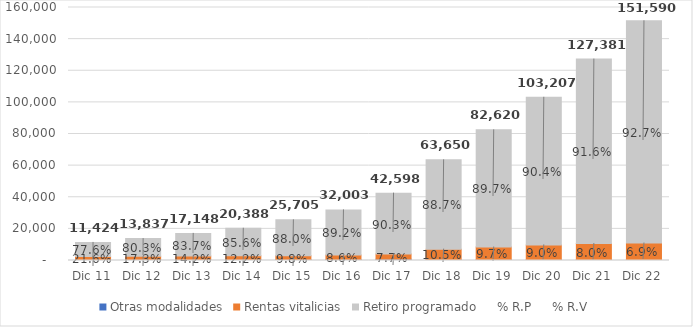
| Category | Otras modalidades | Rentas vitalicias | Retiro programado |
|---|---|---|---|
| Dic 11 | 95 | 2469 | 8860 |
| Dic 12 | 328 | 2394 | 11115 |
| Dic 13 | 369 | 2432 | 14347 |
| Dic 14 | 449 | 2497 | 17442 |
| Dic 15 | 563 | 2518 | 22624 |
| Dic 16 | 696 | 2746 | 28561 |
| Dic 17 | 849 | 3280 | 38469 |
| Dic 18 | 477 | 6712 | 56461 |
| Dic 19 | 515 | 8009 | 74096 |
| Dic 20 | 547 | 9315 | 93345 |
| Dic 21 | 562 | 10201 | 116618 |
| Dic 22 | 577 | 10478 | 140535 |